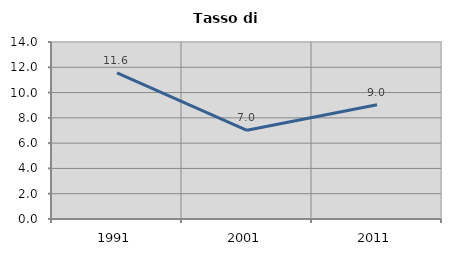
| Category | Tasso di disoccupazione   |
|---|---|
| 1991.0 | 11.562 |
| 2001.0 | 7.015 |
| 2011.0 | 9.041 |